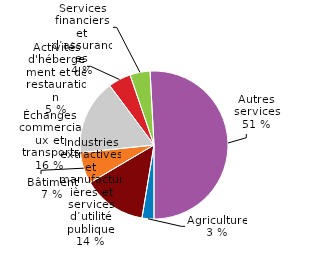
| Category | Series 0 | Series 1 | Series 2 |
|---|---|---|---|
| Agriculture | 2.601 |  |  |
| Mining, manufacturing and utilities | 13.917 |  |  |
| Construction | 6.82 |  |  |
| Trade and transportation | 16.467 |  |  |
| Accomodation and food services | 4.956 |  |  |
| Financial and insurance services | 4.393 |  |  |
| Other services | 50.845 |  |  |